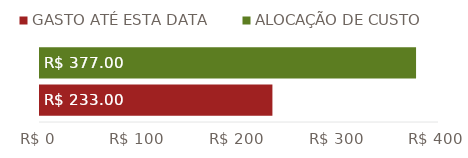
| Category | GASTO ATÉ ESTA DATA | ALOCAÇÃO DE CUSTO |
|---|---|---|
| TOTAIS | 233 | 377 |